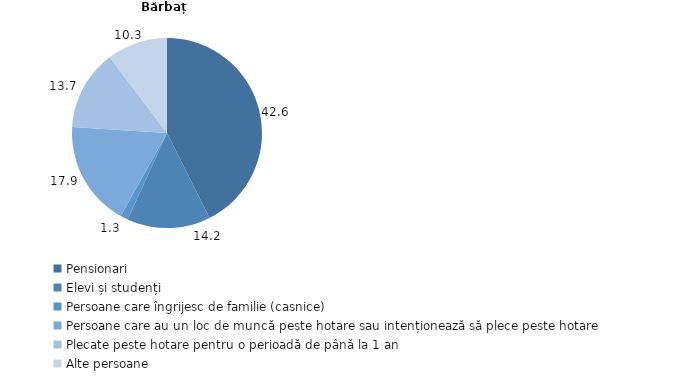
| Category | Bărbați |
|---|---|
| Pensionari | 42.6 |
| Elevi și studenți | 14.2 |
| Persoane care îngrijesc de familie (casnice) | 1.3 |
| Persoane care au un loc de muncă peste hotare sau intenționează să plece peste hotare | 17.9 |
| Plecate peste hotare pentru o perioadă de până la 1 an | 13.7 |
| Alte persoane | 10.3 |